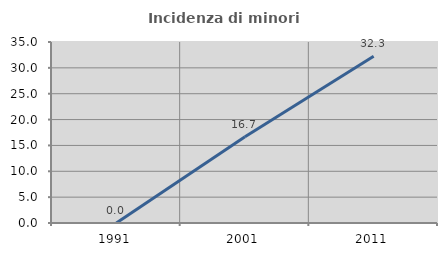
| Category | Incidenza di minori stranieri |
|---|---|
| 1991.0 | 0 |
| 2001.0 | 16.667 |
| 2011.0 | 32.258 |